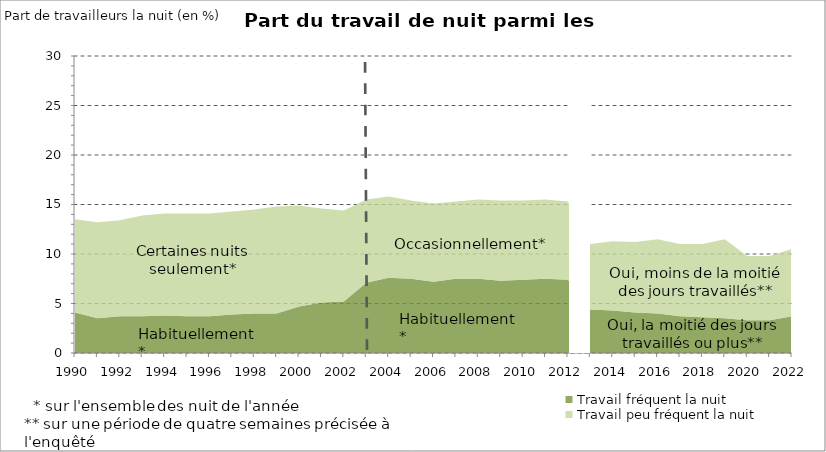
| Category | Travail fréquent la nuit | Travail peu fréquent la nuit |
|---|---|---|
| 1990.0 | 4.1 | 9.4 |
| 1991.0 | 3.5 | 9.7 |
| 1992.0 | 3.7 | 9.7 |
| 1993.0 | 3.7 | 10.2 |
| 1994.0 | 3.8 | 10.3 |
| 1995.0 | 3.7 | 10.4 |
| 1996.0 | 3.7 | 10.4 |
| 1997.0 | 3.9 | 10.4 |
| 1998.0 | 4 | 10.5 |
| 1999.0 | 4 | 10.8 |
| 2000.0 | 4.7 | 10.2 |
| 2001.0 | 5.1 | 9.5 |
| 2002.0 | 5.2 | 9.2 |
| 2003.0 | 7.1 | 8.4 |
| 2004.0 | 7.6 | 8.2 |
| 2005.0 | 7.5 | 7.9 |
| 2006.0 | 7.2 | 7.9 |
| 2007.0 | 7.5 | 7.8 |
| 2008.0 | 7.5 | 8 |
| 2009.0 | 7.3 | 8.1 |
| 2010.0 | 7.4 | 8 |
| 2011.0 | 7.5 | 8 |
| 2012.0 | 7.4 | 7.9 |
| 2013.0 | 4.4 | 6.6 |
| 2014.0 | 4.3 | 7 |
| 2015.0 | 4.1 | 7.1 |
| 2016.0 | 4 | 7.5 |
| 2017.0 | 3.7 | 7.3 |
| 2018.0 | 3.6 | 7.4 |
| 2019.0 | 3.5 | 8 |
| 2020.0 | 3.3 | 6.5 |
| 2021.0 | 3.3 | 6.5 |
| 2022.0 | 3.7 | 6.8 |